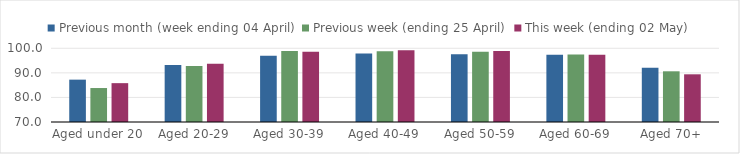
| Category | Previous month (week ending 04 April) | Previous week (ending 25 April) | This week (ending 02 May) |
|---|---|---|---|
| Aged under 20 | 87.238 | 83.826 | 85.813 |
| Aged 20-29 | 93.2 | 92.788 | 93.677 |
| Aged 30-39 | 96.994 | 98.897 | 98.542 |
| Aged 40-49 | 97.929 | 98.801 | 99.152 |
| Aged 50-59 | 97.582 | 98.626 | 98.929 |
| Aged 60-69 | 97.38 | 97.449 | 97.358 |
| Aged 70+ | 92.062 | 90.635 | 89.412 |